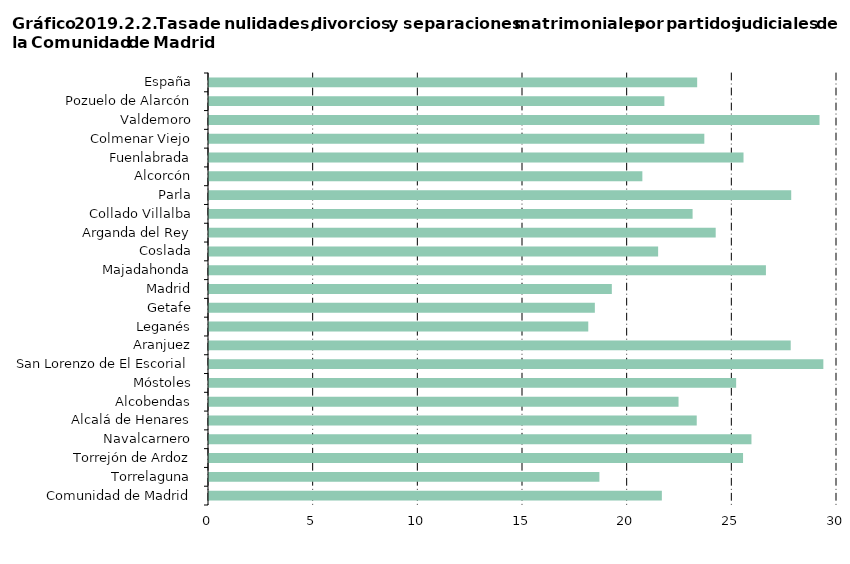
| Category | Series 0 |
|---|---|
| Comunidad de Madrid | 21.633 |
|     Torrelaguna | 18.65 |
|     Torrejón de Ardoz | 25.512 |
|     Navalcarnero | 25.914 |
|     Alcalá de Henares | 23.3 |
|     Alcobendas | 22.43 |
|     Móstoles | 25.183 |
|     San Lorenzo de El Escorial | 29.348 |
|     Aranjuez | 27.789 |
|     Leganés | 18.119 |
|     Getafe | 18.432 |
|     Madrid | 19.243 |
|     Majadahonda | 26.605 |
|     Coslada | 21.456 |
|     Arganda del Rey | 24.205 |
|     Collado Villalba | 23.102 |
|     Parla | 27.813 |
|     Alcorcón | 20.702 |
|     Fuenlabrada | 25.534 |
|     Colmenar Viejo | 23.662 |
|     Valdemoro | 29.165 |
|     Pozuelo de Alarcón | 21.754 |
| España | 23.32 |